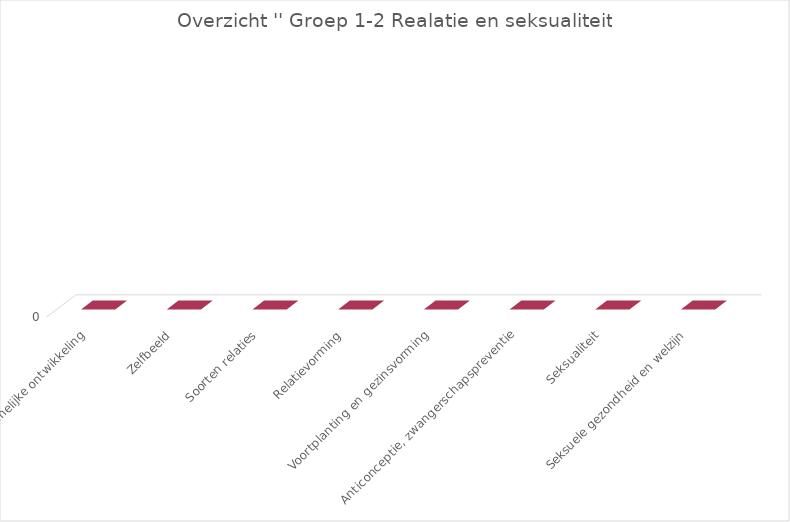
| Category | Series 2 |
|---|---|
| Lichamelijke ontwikkeling | 0 |
| Zelfbeeld | 0 |
| Soorten relaties | 0 |
| Relatievorming | 0 |
| Voortplanting en gezinsvorming | 0 |
| Anticonceptie, zwangerschapspreventie | 0 |
| Seksualiteit | 0 |
| Seksuele gezondheid en welzijn | 0 |